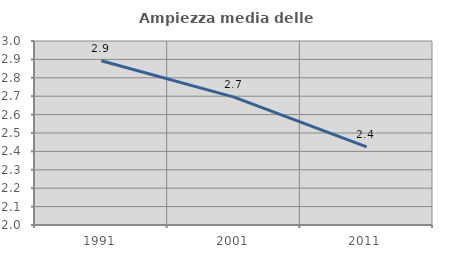
| Category | Ampiezza media delle famiglie |
|---|---|
| 1991.0 | 2.893 |
| 2001.0 | 2.695 |
| 2011.0 | 2.425 |